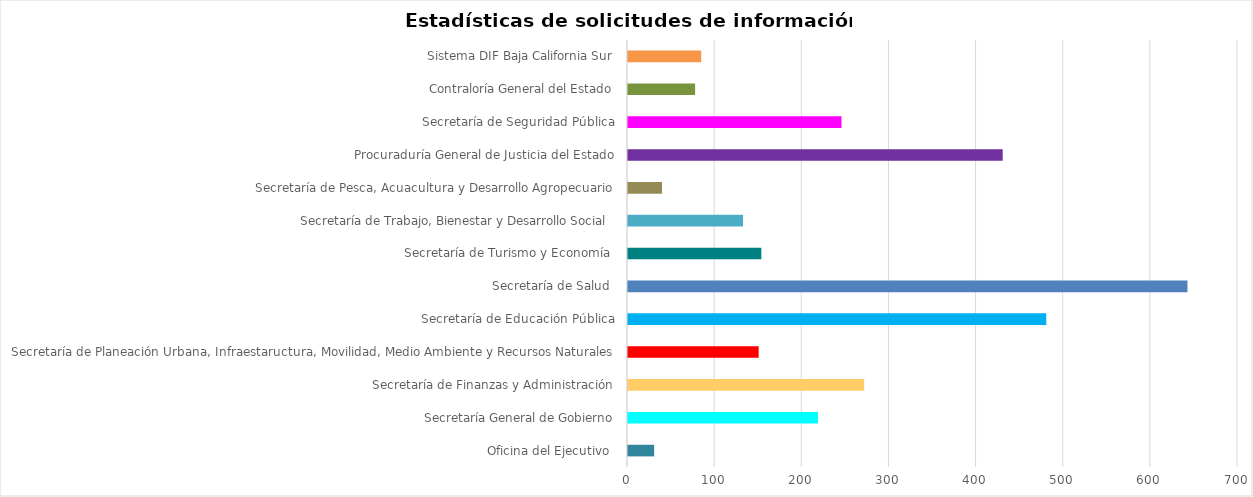
| Category | Series 0 |
|---|---|
| Oficina del Ejecutivo  | 30 |
| Secretaría General de Gobierno | 218 |
| Secretaría de Finanzas y Administración | 271 |
| Secretaría de Planeación Urbana, Infraestaructura, Movilidad, Medio Ambiente y Recursos Naturales | 150 |
| Secretaría de Educación Pública | 480 |
| Secretaría de Salud  | 642 |
| Secretaría de Turismo y Economía  | 153 |
| Secretaría de Trabajo, Bienestar y Desarrollo Social  | 132 |
| Secretaría de Pesca, Acuacultura y Desarrollo Agropecuario | 39 |
| Procuraduría General de Justicia del Estado | 430 |
| Secretaría de Seguridad Pública | 245 |
| Contraloría General del Estado | 77 |
| Sistema DIF Baja California Sur | 84 |